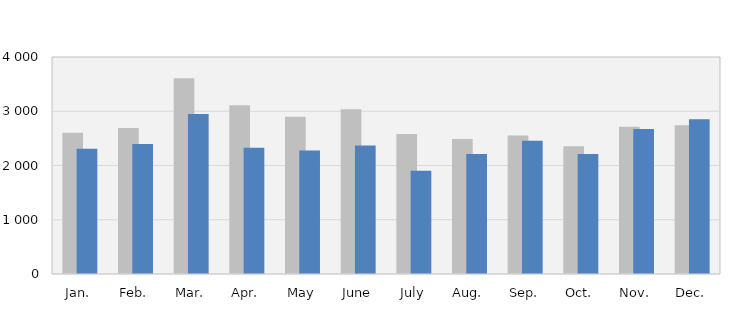
| Category | 2021 | 2022 |
|---|---|---|
| Jan. | 2604 | 2308 |
| Feb. | 2690 | 2398 |
| Mar. | 3610 | 2951 |
| Apr. | 3111 | 2328 |
| May | 2900 | 2276 |
| June | 3039 | 2370 |
| July | 2579 | 1905 |
| Aug. | 2487 | 2212 |
| Sep. | 2551 | 2455 |
| Oct. | 2355 | 2210 |
| Nov. | 2714 | 2675 |
| Dec. | 2740 | 2854 |